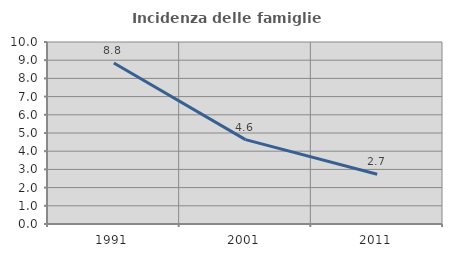
| Category | Incidenza delle famiglie numerose |
|---|---|
| 1991.0 | 8.846 |
| 2001.0 | 4.634 |
| 2011.0 | 2.735 |